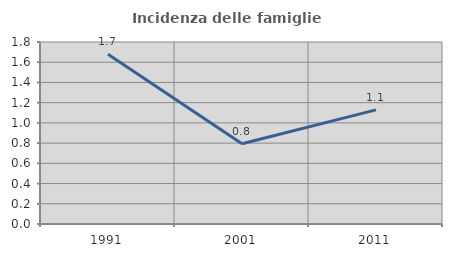
| Category | Incidenza delle famiglie numerose |
|---|---|
| 1991.0 | 1.679 |
| 2001.0 | 0.793 |
| 2011.0 | 1.129 |